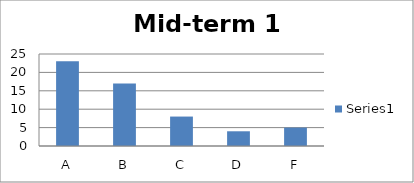
| Category | Series 0 |
|---|---|
| A | 23 |
| B | 17 |
| C | 8 |
| D | 4 |
| F | 5 |